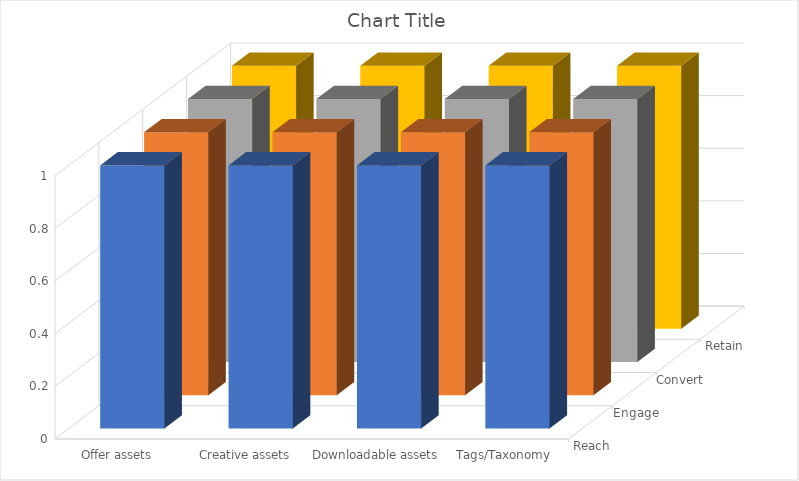
| Category | Reach | Engage | Convert | Retain |
|---|---|---|---|---|
| Offer assets | 1 | 1 | 1 | 1 |
| Creative assets | 1 | 1 | 1 | 1 |
| Downloadable assets | 1 | 1 | 1 | 1 |
| Tags/Taxonomy management | 1 | 1 | 1 | 1 |